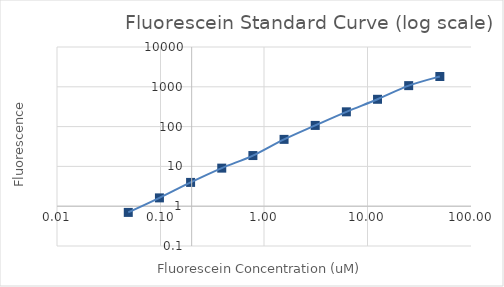
| Category | Series 1 |
|---|---|
| 50.0 | 1812.75 |
| 25.0 | 1070.05 |
| 12.5 | 485.5 |
| 6.25 | 235.175 |
| 3.125 | 107.065 |
| 1.5625 | 47.758 |
| 0.78125 | 18.738 |
| 0.390625 | 9.046 |
| 0.1953125 | 3.961 |
| 0.09765625 | 1.618 |
| 0.048828125 | 0.698 |